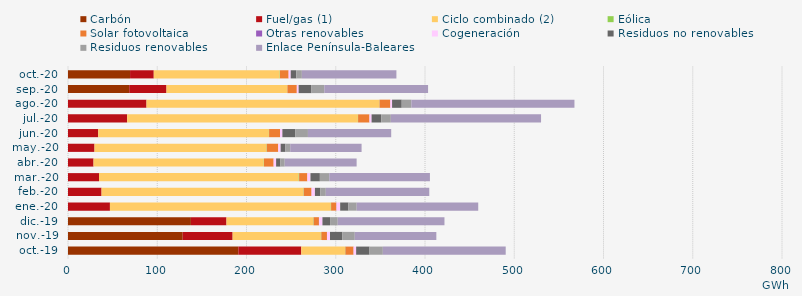
| Category | Carbón | Fuel/gas (1) | Ciclo combinado (2) | Eólica | Solar fotovoltaica | Otras renovables | Cogeneración | Residuos no renovables | Residuos renovables | Enlace Península-Baleares |
|---|---|---|---|---|---|---|---|---|---|---|
| oct.-19 | 190.859 | 70.493 | 49.055 | 0.402 | 9.134 | 0.099 | 2.81 | 14.954 | 14.954 | 137.666 |
| nov.-19 | 128.514 | 55.933 | 98.892 | 0.495 | 6.297 | 0.093 | 3.33 | 13.875 | 13.875 | 91.397 |
| dic.-19 | 137.717 | 39.851 | 97.226 | 0.445 | 5.906 | 0.181 | 3.776 | 8.548 | 8.548 | 119.614 |
| ene.-20 | -3.177 | 46.988 | 247.428 | 0.371 | 5.931 | 0.201 | 4.038 | 9.262 | 9.262 | 136.156 |
| feb.-20 | -1.357 | 37.598 | 226.174 | 0.339 | 8.736 | 0.082 | 3.745 | 6.096 | 6.096 | 115.928 |
| mar.-20 | -1.702 | 34.745 | 223.688 | 0.533 | 9.203 | 0.027 | 3.476 | 10.532 | 10.532 | 112.78 |
| abr.-20 | -1.681 | 28.608 | 190.732 | 0.243 | 10.819 | 0.015 | 2.76 | 4.815 | 4.815 | 80.581 |
| may.-20 | -1.801 | 29.693 | 192.661 | 0.353 | 12.877 | 0.002 | 2.681 | 5.366 | 5.366 | 79.947 |
| jun.-20 | -1.281 | 33.873 | 191.226 | 0.218 | 12.233 | 0.06 | 2.597 | 14.316 | 14.316 | 93.29 |
| jul.-20 | -1.12 | 66.276 | 258.526 | 0.221 | 12.747 | 0.053 | 2.332 | 10.772 | 10.772 | 168.332 |
| ago.-20 | -1.127 | 87.96 | 260.888 | 0.207 | 12.085 | 0.051 | 1.922 | 10.811 | 10.811 | 182.716 |
| sep.-20 | 68.615 | 41.727 | 135.309 | 0.19 | 10.526 | 0.003 | 2.048 | 14.376 | 14.376 | 116.275 |
| oct.-20 | 69.532 | 26.56 | 141.136 | 0.328 | 9.629 | 0.027 | 2.333 | 6.238 | 6.238 | 105.944 |